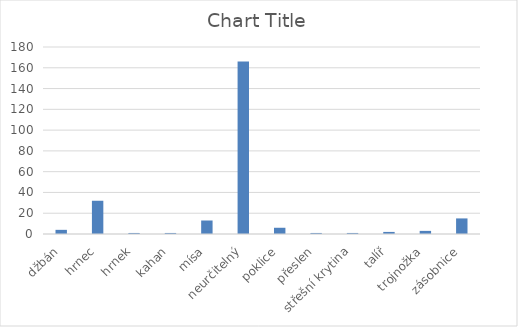
| Category | Series 0 |
|---|---|
| džbán | 4 |
| hrnec | 32 |
| hrnek | 1 |
| kahan | 1 |
| mísa | 13 |
| neurčitelný | 166 |
| poklice | 6 |
| přeslen | 1 |
| střešní krytina | 1 |
| talíř | 2 |
| trojnožka | 3 |
| zásobnice | 15 |